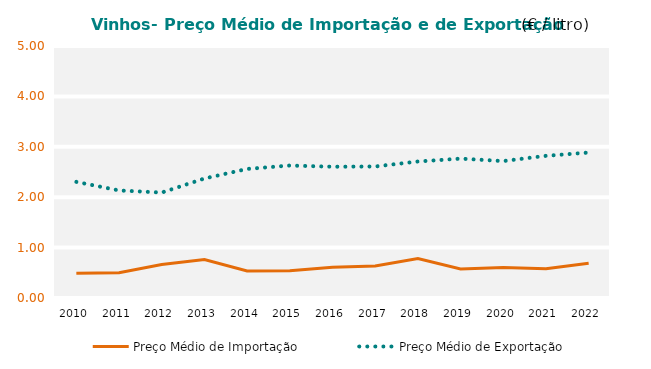
| Category | Preço Médio de Importação | Preço Médio de Exportação |
|---|---|---|
| 2010.0 | 0.493 | 2.304 |
| 2011.0 | 0.501 | 2.134 |
| 2012.0 | 0.666 | 2.092 |
| 2013.0 | 0.765 | 2.371 |
| 2014.0 | 0.537 | 2.561 |
| 2015.0 | 0.54 | 2.629 |
| 2016.0 | 0.609 | 2.605 |
| 2017.0 | 0.636 | 2.61 |
| 2018.0 | 0.782 | 2.708 |
| 2019.0 | 0.576 | 2.765 |
| 2020.0 | 0.606 | 2.717 |
| 2021.0 | 0.582 | 2.821 |
| 2022.0 | 0.691 | 2.886 |